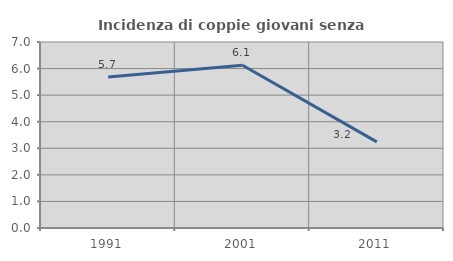
| Category | Incidenza di coppie giovani senza figli |
|---|---|
| 1991.0 | 5.684 |
| 2001.0 | 6.122 |
| 2011.0 | 3.241 |